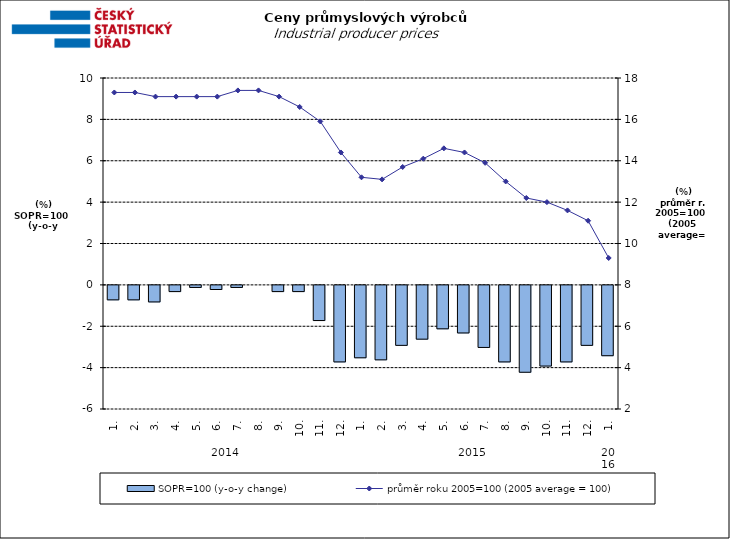
| Category | SOPR=100 (y-o-y change)   |
|---|---|
| 0 | -0.7 |
| 1 | -0.7 |
| 2 | -0.8 |
| 3 | -0.3 |
| 4 | -0.1 |
| 5 | -0.2 |
| 6 | -0.1 |
| 7 | 0 |
| 8 | -0.3 |
| 9 | -0.3 |
| 10 | -1.7 |
| 11 | -3.7 |
| 12 | -3.5 |
| 13 | -3.6 |
| 14 | -2.9 |
| 15 | -2.6 |
| 16 | -2.1 |
| 17 | -2.3 |
| 18 | -3 |
| 19 | -3.7 |
| 20 | -4.2 |
| 21 | -3.9 |
| 22 | -3.7 |
| 23 | -2.9 |
| 24 | -3.4 |